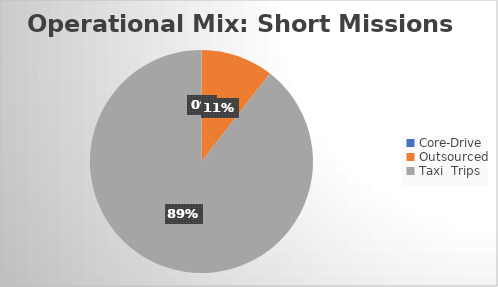
| Category | Series 0 |
|---|---|
| Core-Drive | 0 |
| Outsourced | 2 |
| Taxi  Trips | 17 |